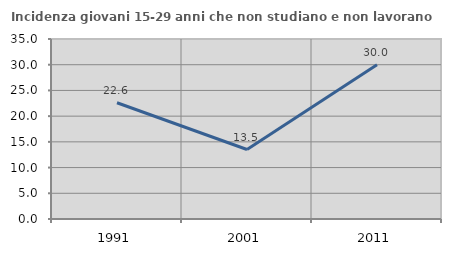
| Category | Incidenza giovani 15-29 anni che non studiano e non lavorano  |
|---|---|
| 1991.0 | 22.604 |
| 2001.0 | 13.514 |
| 2011.0 | 30 |